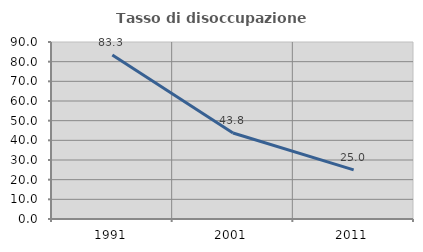
| Category | Tasso di disoccupazione giovanile  |
|---|---|
| 1991.0 | 83.333 |
| 2001.0 | 43.75 |
| 2011.0 | 25 |